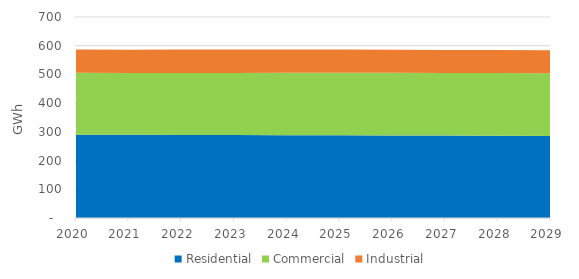
| Category | Residential | Commercial | Industrial |
|---|---|---|---|
| 2020.0 | 290.263 | 215.846 | 80.704 |
| 2021.0 | 289.615 | 215.661 | 80.821 |
| 2022.0 | 289.217 | 215.905 | 81.449 |
| 2023.0 | 288.89 | 216.51 | 81.525 |
| 2024.0 | 288.522 | 216.97 | 81.49 |
| 2025.0 | 288.116 | 217.399 | 81.236 |
| 2026.0 | 287.629 | 217.791 | 80.807 |
| 2027.0 | 287.042 | 218.09 | 80.316 |
| 2028.0 | 286.345 | 218.429 | 80.126 |
| 2029.0 | 285.591 | 218.874 | 79.966 |